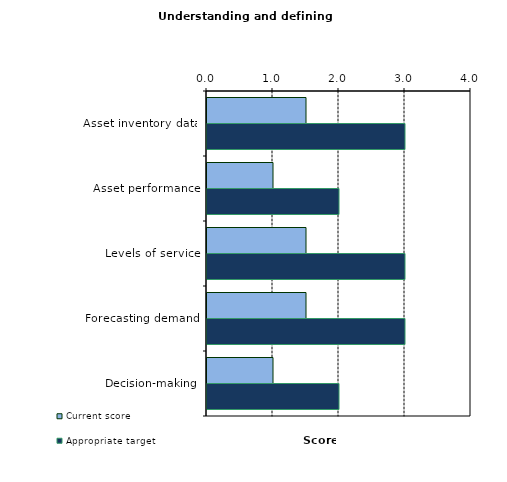
| Category | Current score | Appropriate target |
|---|---|---|
| Asset inventory data | 1.5 | 3 |
| Asset performance | 1 | 2 |
| Levels of service | 1.5 | 3 |
| Forecasting demand | 1.5 | 3 |
| Decision-making | 1 | 2 |